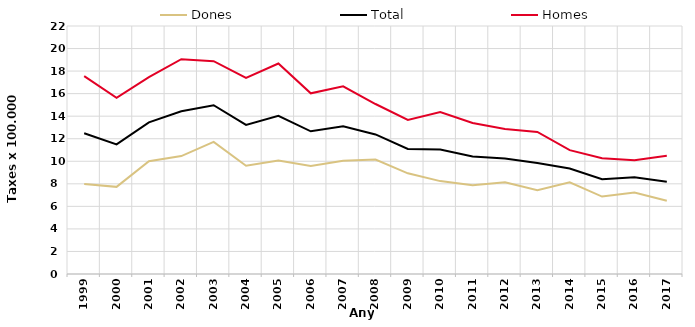
| Category | Dones | Total | Homes |
|---|---|---|---|
| 1999.0 | 7.99 | 12.49 | 17.55 |
| 2000.0 | 7.73 | 11.5 | 15.62 |
| 2001.0 | 10 | 13.45 | 17.47 |
| 2002.0 | 10.46 | 14.44 | 19.06 |
| 2003.0 | 11.72 | 14.97 | 18.88 |
| 2004.0 | 9.6 | 13.23 | 17.4 |
| 2005.0 | 10.06 | 14.04 | 18.67 |
| 2006.0 | 9.59 | 12.66 | 16.03 |
| 2007.0 | 10.05 | 13.1 | 16.65 |
| 2008.0 | 10.15 | 12.38 | 15.08 |
| 2009.0 | 8.93 | 11.09 | 13.67 |
| 2010.0 | 8.24 | 11.04 | 14.37 |
| 2011.0 | 7.87 | 10.42 | 13.4 |
| 2012.0 | 8.13 | 10.24 | 12.86 |
| 2013.0 | 7.43 | 9.85 | 12.6 |
| 2014.0 | 8.13 | 9.36 | 10.99 |
| 2015.0 | 6.87 | 8.4 | 10.26 |
| 2016.0 | 7.23 | 8.58 | 10.09 |
| 2017.0 | 6.5 | 8.19 | 10.49 |